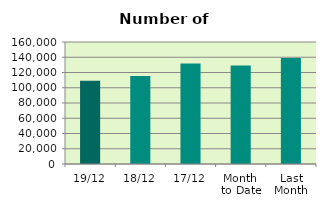
| Category | Series 0 |
|---|---|
| 19/12 | 109340 |
| 18/12 | 115360 |
| 17/12 | 131730 |
| Month 
to Date | 129133 |
| Last
Month | 138953.619 |